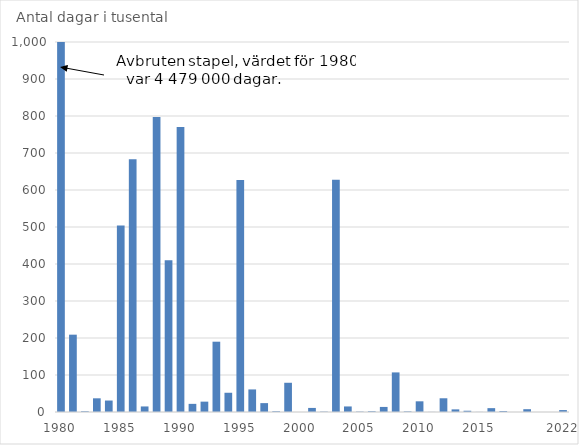
| Category | Antal dagar i tusental |
|---|---|
| 1980.0 | 1000 |
| nan | 209 |
| nan | 2 |
| nan | 37 |
| nan | 31 |
| 1985.0 | 504 |
| nan | 683 |
| nan | 15 |
| nan | 797 |
| nan | 410 |
| 1990.0 | 770 |
| nan | 22 |
| nan | 28 |
| nan | 190 |
| nan | 52 |
| 1995.0 | 627 |
| nan | 61 |
| nan | 24 |
| nan | 2 |
| nan | 79 |
| 2000.0 | 0 |
| nan | 11 |
| nan | 1 |
| nan | 628 |
| nan | 15 |
| 2005.0 | 1 |
| nan | 2 |
| nan | 13.7 |
| nan | 107 |
| nan | 1.6 |
| 2010.0 | 28.9 |
| nan | 0.254 |
| nan | 37.1 |
| nan | 7.1 |
| nan | 3.4 |
| 2015.0 | 0.234 |
| nan | 10.417 |
| nan | 2.57 |
| nan | 0.05 |
| nan | 7.58 |
| nan | 0 |
| nan | 0.011 |
| 2022.0 | 5.2 |